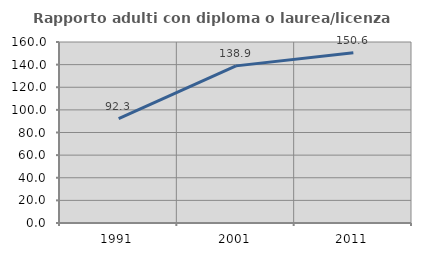
| Category | Rapporto adulti con diploma o laurea/licenza media  |
|---|---|
| 1991.0 | 92.265 |
| 2001.0 | 138.889 |
| 2011.0 | 150.568 |